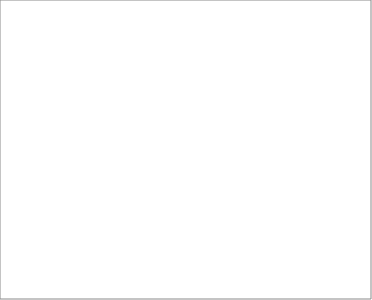
| Category | 2004 | 2005 | 2006 | 2008 | 2009 | 2010 | 2011 | 2012 | 2013 |
|---|---|---|---|---|---|---|---|---|---|
| Belgia | 1 |  |  |  |  |  |  |  |  |